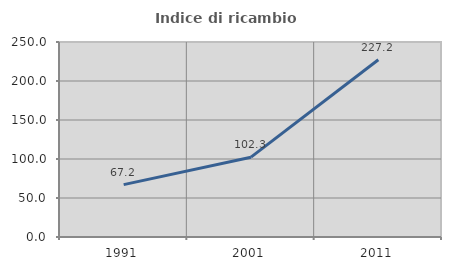
| Category | Indice di ricambio occupazionale  |
|---|---|
| 1991.0 | 67.188 |
| 2001.0 | 102.335 |
| 2011.0 | 227.16 |